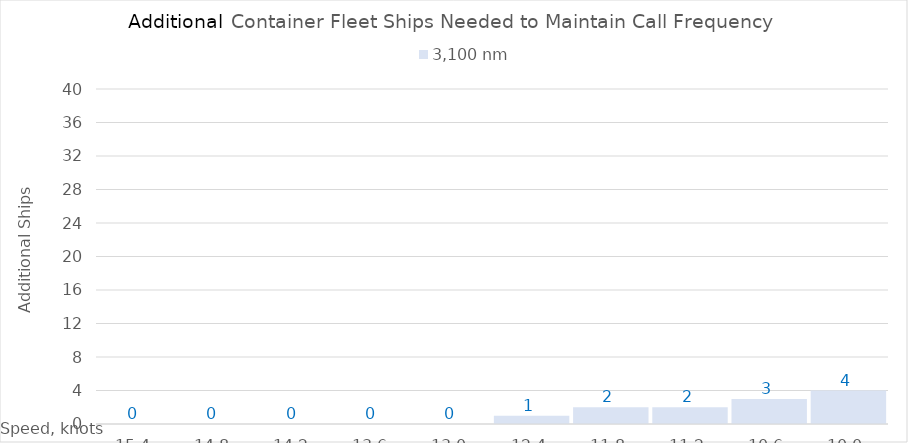
| Category | 3,100 |
|---|---|
| 15.4 | 0 |
| 14.8 | 0 |
| 14.200000000000001 | 0 |
| 13.600000000000001 | 0 |
| 13.000000000000002 | 0 |
| 12.400000000000002 | 1 |
| 11.800000000000002 | 2 |
| 11.200000000000003 | 2 |
| 10.600000000000003 | 3 |
| 10.000000000000004 | 4 |